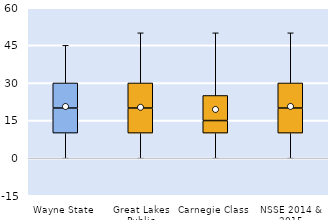
| Category | 25th | 50th | 75th |
|---|---|---|---|
| Wayne State | 10 | 10 | 10 |
| Great Lakes Public | 10 | 10 | 10 |
| Carnegie Class | 10 | 5 | 10 |
| NSSE 2014 & 2015 | 10 | 10 | 10 |